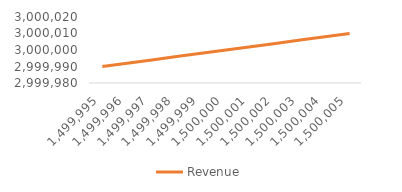
| Category | Revenue |
|---|---|
| 1499995.0 | 2999990 |
| 1499996.0 | 2999992 |
| 1499997.0 | 2999994 |
| 1499998.0 | 2999996 |
| 1499999.0 | 2999998 |
| 1500000.0 | 3000000 |
| 1500001.0 | 3000002 |
| 1500002.0 | 3000004 |
| 1500003.0 | 3000006 |
| 1500004.0 | 3000008 |
| 1500005.0 | 3000010 |